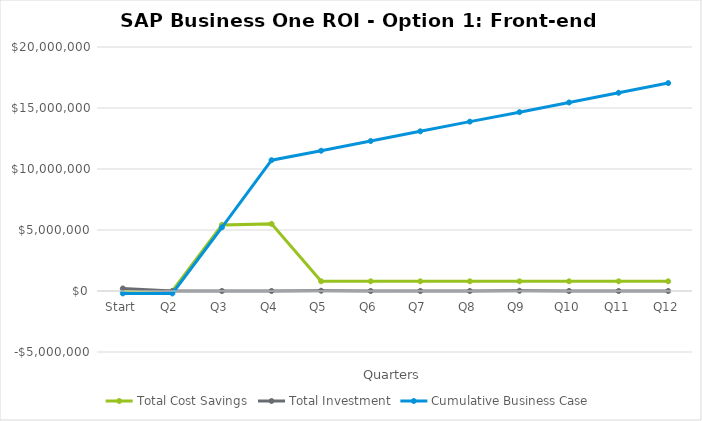
| Category | Total Cost Savings | Total Investment | Cumulative Business Case |
|---|---|---|---|
| Start | 10000 | 209000 | -199000 |
| Q2 | 0 | 0 | -199000 |
| Q3 | 5419345.63 | 0 | 5220345.63 |
| Q4 | 5501170.63 | 0 | 10721516.261 |
| Q5 | 794915.182 | 19000 | 11497431.443 |
| Q6 | 794915.182 | 0 | 12292346.625 |
| Q7 | 794915.182 | 0 | 13087261.807 |
| Q8 | 794915.182 | 0 | 13882176.989 |
| Q9 | 794915.182 | 19000 | 14658092.172 |
| Q10 | 794915.182 | 0 | 15453007.354 |
| Q11 | 794915.182 | 0 | 16247922.536 |
| Q12 | 794915.182 | 0 | 17042837.718 |